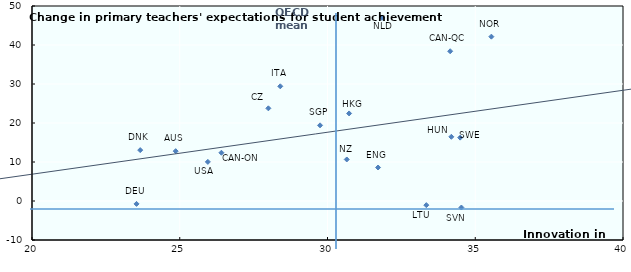
| Category | Series 0 |
|---|---|
| 24.86236065802155 | 12.777 |
| 26.41069453385446 | 12.375 |
| 34.151712508876976 | 38.396 |
| 27.99829092620979 | 23.761 |
| 23.661962134845087 | 13.048 |
| 23.537108547148677 | -0.742 |
| 30.731168077572757 | 22.448 |
| 34.190599255746456 | 16.459 |
| 28.402220072461642 | 29.408 |
| 33.344330555296764 | -1.065 |
| 31.841841492033375 | 46.966 |
| 30.652353898930272 | 10.647 |
| 35.54521768255994 | 42.143 |
| 29.748494369415628 | 19.403 |
| 34.53082479407698 | -1.675 |
| 34.489196848677345 | 16.249 |
| 31.71066827992079 | 8.59 |
| 25.951431177341984 | 10.031 |